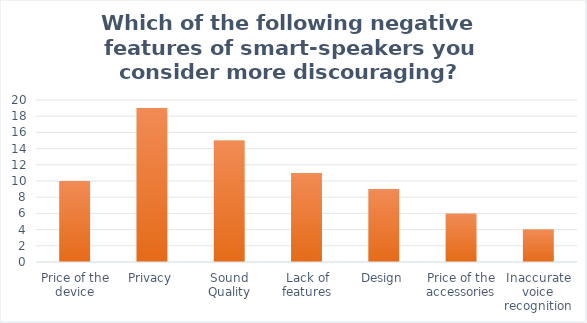
| Category | Series 0 |
|---|---|
| Price of the device | 10 |
| Privacy | 19 |
| Sound Quality | 15 |
| Lack of features | 11 |
| Design | 9 |
| Price of the accessories | 6 |
| Inaccurate voice recognition | 4 |